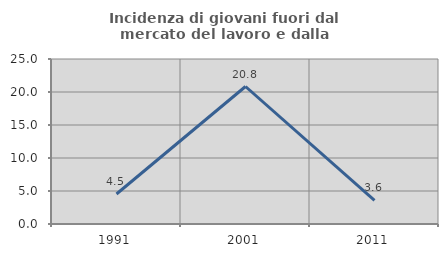
| Category | Incidenza di giovani fuori dal mercato del lavoro e dalla formazione  |
|---|---|
| 1991.0 | 4.545 |
| 2001.0 | 20.833 |
| 2011.0 | 3.571 |